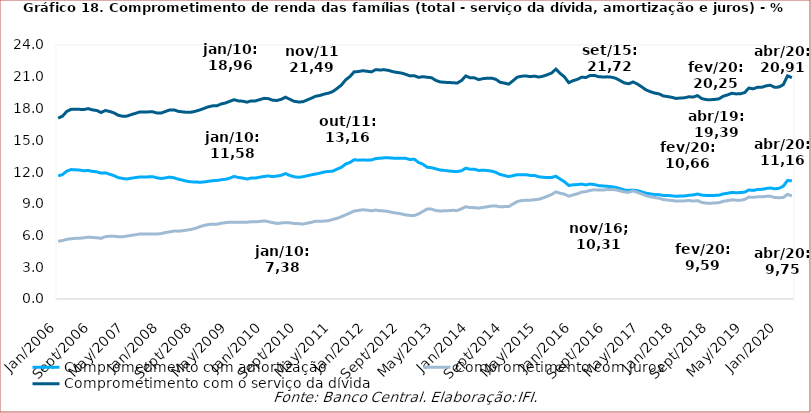
| Category | Comprometimento com amortização | Comprometimento com juros | Comprometimento com o serviço da dívida |
|---|---|---|---|
| 2006-01-01 | 11.63 | 5.46 | 17.09 |
| 2006-02-01 | 11.75 | 5.52 | 17.27 |
| 2006-03-01 | 12.08 | 5.64 | 17.72 |
| 2006-04-01 | 12.23 | 5.69 | 17.92 |
| 2006-05-01 | 12.21 | 5.73 | 17.94 |
| 2006-06-01 | 12.18 | 5.74 | 17.92 |
| 2006-07-01 | 12.12 | 5.78 | 17.9 |
| 2006-08-01 | 12.14 | 5.85 | 17.99 |
| 2006-09-01 | 12.06 | 5.81 | 17.87 |
| 2006-10-01 | 12.02 | 5.79 | 17.81 |
| 2006-11-01 | 11.89 | 5.73 | 17.62 |
| 2006-12-01 | 11.92 | 5.89 | 17.81 |
| 2007-01-01 | 11.79 | 5.93 | 17.72 |
| 2007-02-01 | 11.66 | 5.93 | 17.59 |
| 2007-03-01 | 11.47 | 5.89 | 17.36 |
| 2007-04-01 | 11.39 | 5.88 | 17.27 |
| 2007-05-01 | 11.34 | 5.94 | 17.28 |
| 2007-06-01 | 11.41 | 6.01 | 17.42 |
| 2007-07-01 | 11.47 | 6.07 | 17.54 |
| 2007-08-01 | 11.53 | 6.14 | 17.67 |
| 2007-09-01 | 11.52 | 6.14 | 17.66 |
| 2007-10-01 | 11.54 | 6.14 | 17.68 |
| 2007-11-01 | 11.56 | 6.13 | 17.69 |
| 2007-12-01 | 11.45 | 6.13 | 17.58 |
| 2008-01-01 | 11.39 | 6.18 | 17.57 |
| 2008-02-01 | 11.44 | 6.28 | 17.72 |
| 2008-03-01 | 11.52 | 6.34 | 17.86 |
| 2008-04-01 | 11.45 | 6.42 | 17.87 |
| 2008-05-01 | 11.32 | 6.41 | 17.73 |
| 2008-06-01 | 11.23 | 6.45 | 17.68 |
| 2008-07-01 | 11.13 | 6.51 | 17.64 |
| 2008-08-01 | 11.07 | 6.58 | 17.65 |
| 2008-09-01 | 11.06 | 6.68 | 17.74 |
| 2008-10-01 | 11.03 | 6.83 | 17.86 |
| 2008-11-01 | 11.06 | 6.95 | 18.01 |
| 2008-12-01 | 11.12 | 7.04 | 18.16 |
| 2009-01-01 | 11.18 | 7.07 | 18.25 |
| 2009-02-01 | 11.2 | 7.06 | 18.26 |
| 2009-03-01 | 11.27 | 7.16 | 18.43 |
| 2009-04-01 | 11.31 | 7.21 | 18.52 |
| 2009-05-01 | 11.42 | 7.26 | 18.68 |
| 2009-06-01 | 11.58 | 7.25 | 18.83 |
| 2009-07-01 | 11.48 | 7.24 | 18.72 |
| 2009-08-01 | 11.43 | 7.26 | 18.69 |
| 2009-09-01 | 11.34 | 7.26 | 18.6 |
| 2009-10-01 | 11.43 | 7.29 | 18.72 |
| 2009-11-01 | 11.43 | 7.29 | 18.72 |
| 2009-12-01 | 11.51 | 7.33 | 18.84 |
| 2010-01-01 | 11.58 | 7.38 | 18.96 |
| 2010-02-01 | 11.63 | 7.3 | 18.93 |
| 2010-03-01 | 11.56 | 7.22 | 18.78 |
| 2010-04-01 | 11.62 | 7.14 | 18.76 |
| 2010-05-01 | 11.69 | 7.18 | 18.87 |
| 2010-06-01 | 11.85 | 7.22 | 19.07 |
| 2010-07-01 | 11.67 | 7.2 | 18.87 |
| 2010-08-01 | 11.55 | 7.13 | 18.68 |
| 2010-09-01 | 11.5 | 7.12 | 18.62 |
| 2010-10-01 | 11.55 | 7.08 | 18.63 |
| 2010-11-01 | 11.64 | 7.16 | 18.8 |
| 2010-12-01 | 11.73 | 7.24 | 18.97 |
| 2011-01-01 | 11.81 | 7.35 | 19.16 |
| 2011-02-01 | 11.89 | 7.34 | 19.23 |
| 2011-03-01 | 12 | 7.36 | 19.36 |
| 2011-04-01 | 12.05 | 7.4 | 19.45 |
| 2011-05-01 | 12.08 | 7.52 | 19.6 |
| 2011-06-01 | 12.27 | 7.62 | 19.89 |
| 2011-07-01 | 12.44 | 7.77 | 20.21 |
| 2011-08-01 | 12.75 | 7.95 | 20.7 |
| 2011-09-01 | 12.9 | 8.12 | 21.02 |
| 2011-10-01 | 13.16 | 8.31 | 21.47 |
| 2011-11-01 | 13.12 | 8.37 | 21.49 |
| 2011-12-01 | 13.14 | 8.43 | 21.57 |
| 2012-01-01 | 13.12 | 8.4 | 21.52 |
| 2012-02-01 | 13.13 | 8.33 | 21.46 |
| 2012-03-01 | 13.27 | 8.4 | 21.67 |
| 2012-04-01 | 13.3 | 8.34 | 21.64 |
| 2012-05-01 | 13.34 | 8.32 | 21.66 |
| 2012-06-01 | 13.34 | 8.26 | 21.6 |
| 2012-07-01 | 13.31 | 8.17 | 21.48 |
| 2012-08-01 | 13.3 | 8.11 | 21.41 |
| 2012-09-01 | 13.31 | 8.04 | 21.35 |
| 2012-10-01 | 13.29 | 7.94 | 21.23 |
| 2012-11-01 | 13.18 | 7.9 | 21.08 |
| 2012-12-01 | 13.21 | 7.89 | 21.1 |
| 2013-01-01 | 12.9 | 8.04 | 20.94 |
| 2013-02-01 | 12.74 | 8.27 | 21.01 |
| 2013-03-01 | 12.45 | 8.5 | 20.95 |
| 2013-04-01 | 12.41 | 8.5 | 20.91 |
| 2013-05-01 | 12.3 | 8.36 | 20.66 |
| 2013-06-01 | 12.19 | 8.32 | 20.51 |
| 2013-07-01 | 12.15 | 8.33 | 20.48 |
| 2013-08-01 | 12.1 | 8.35 | 20.45 |
| 2013-09-01 | 12.06 | 8.38 | 20.44 |
| 2013-10-01 | 12.04 | 8.36 | 20.4 |
| 2013-11-01 | 12.12 | 8.52 | 20.64 |
| 2013-12-01 | 12.36 | 8.72 | 21.08 |
| 2014-01-01 | 12.26 | 8.64 | 20.9 |
| 2014-02-01 | 12.27 | 8.63 | 20.9 |
| 2014-03-01 | 12.14 | 8.59 | 20.73 |
| 2014-04-01 | 12.17 | 8.65 | 20.82 |
| 2014-05-01 | 12.14 | 8.72 | 20.86 |
| 2014-06-01 | 12.09 | 8.78 | 20.87 |
| 2014-07-01 | 11.97 | 8.79 | 20.76 |
| 2014-08-01 | 11.77 | 8.71 | 20.48 |
| 2014-09-01 | 11.67 | 8.73 | 20.4 |
| 2014-10-01 | 11.57 | 8.73 | 20.3 |
| 2014-11-01 | 11.65 | 8.97 | 20.62 |
| 2014-12-01 | 11.75 | 9.21 | 20.96 |
| 2015-01-01 | 11.75 | 9.3 | 21.05 |
| 2015-02-01 | 11.75 | 9.33 | 21.08 |
| 2015-03-01 | 11.68 | 9.33 | 21.01 |
| 2015-04-01 | 11.68 | 9.38 | 21.06 |
| 2015-05-01 | 11.55 | 9.42 | 20.97 |
| 2015-06-01 | 11.5 | 9.55 | 21.05 |
| 2015-07-01 | 11.48 | 9.71 | 21.19 |
| 2015-08-01 | 11.48 | 9.87 | 21.35 |
| 2015-09-01 | 11.6 | 10.12 | 21.72 |
| 2015-10-01 | 11.33 | 9.99 | 21.32 |
| 2015-11-01 | 11.08 | 9.91 | 20.99 |
| 2015-12-01 | 10.73 | 9.71 | 20.44 |
| 2016-01-01 | 10.79 | 9.84 | 20.63 |
| 2016-02-01 | 10.81 | 9.94 | 20.75 |
| 2016-03-01 | 10.86 | 10.1 | 20.96 |
| 2016-04-01 | 10.78 | 10.15 | 20.93 |
| 2016-05-01 | 10.86 | 10.26 | 21.12 |
| 2016-06-01 | 10.81 | 10.32 | 21.13 |
| 2016-07-01 | 10.71 | 10.29 | 21 |
| 2016-08-01 | 10.68 | 10.3 | 20.98 |
| 2016-09-01 | 10.65 | 10.34 | 20.99 |
| 2016-10-01 | 10.61 | 10.35 | 20.96 |
| 2016-11-01 | 10.54 | 10.31 | 20.85 |
| 2016-12-01 | 10.42 | 10.21 | 20.63 |
| 2017-01-01 | 10.3 | 10.11 | 20.41 |
| 2017-02-01 | 10.26 | 10.08 | 20.34 |
| 2017-03-01 | 10.29 | 10.22 | 20.51 |
| 2017-04-01 | 10.24 | 10.07 | 20.31 |
| 2017-05-01 | 10.12 | 9.93 | 20.05 |
| 2017-06-01 | 10 | 9.76 | 19.76 |
| 2017-07-01 | 9.93 | 9.66 | 19.59 |
| 2017-08-01 | 9.87 | 9.59 | 19.46 |
| 2017-09-01 | 9.86 | 9.53 | 19.39 |
| 2017-10-01 | 9.79 | 9.4 | 19.19 |
| 2017-11-01 | 9.78 | 9.35 | 19.13 |
| 2017-12-01 | 9.75 | 9.31 | 19.06 |
| 2018-01-01 | 9.7 | 9.25 | 18.95 |
| 2018-02-01 | 9.73 | 9.26 | 18.99 |
| 2018-03-01 | 9.74 | 9.27 | 19.01 |
| 2018-04-01 | 9.8 | 9.31 | 19.11 |
| 2018-05-01 | 9.83 | 9.25 | 19.08 |
| 2018-06-01 | 9.92 | 9.3 | 19.22 |
| 2018-07-01 | 9.82 | 9.12 | 18.94 |
| 2018-08-01 | 9.78 | 9.06 | 18.84 |
| 2018-09-01 | 9.78 | 9.05 | 18.83 |
| 2018-10-01 | 9.79 | 9.07 | 18.86 |
| 2018-11-01 | 9.81 | 9.1 | 18.91 |
| 2018-12-01 | 9.93 | 9.23 | 19.16 |
| 2019-01-01 | 9.99 | 9.29 | 19.28 |
| 2019-02-01 | 10.07 | 9.37 | 19.44 |
| 2019-03-01 | 10.04 | 9.34 | 19.38 |
| 2019-04-01 | 10.06 | 9.33 | 19.39 |
| 2019-05-01 | 10.1 | 9.41 | 19.51 |
| 2019-06-01 | 10.3 | 9.63 | 19.93 |
| 2019-07-01 | 10.26 | 9.6 | 19.86 |
| 2019-08-01 | 10.35 | 9.66 | 20.01 |
| 2019-09-01 | 10.36 | 9.65 | 20.01 |
| 2019-10-01 | 10.44 | 9.7 | 20.14 |
| 2019-11-01 | 10.49 | 9.71 | 20.2 |
| 2019-12-01 | 10.41 | 9.59 | 20 |
| 2020-01-01 | 10.46 | 9.57 | 20.03 |
| 2020-02-01 | 10.66 | 9.59 | 20.25 |
| 2020-03-01 | 11.2 | 9.89 | 21.09 |
| 2020-04-01 | 11.16 | 9.75 | 20.91 |